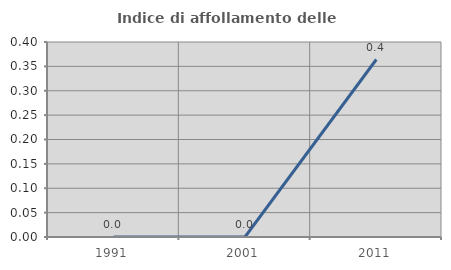
| Category | Indice di affollamento delle abitazioni  |
|---|---|
| 1991.0 | 0 |
| 2001.0 | 0 |
| 2011.0 | 0.364 |